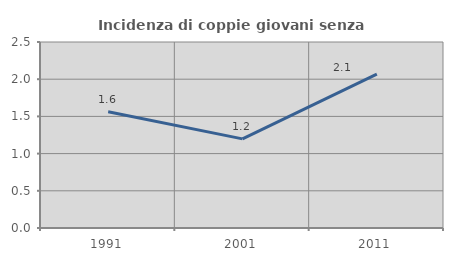
| Category | Incidenza di coppie giovani senza figli |
|---|---|
| 1991.0 | 1.562 |
| 2001.0 | 1.198 |
| 2011.0 | 2.069 |